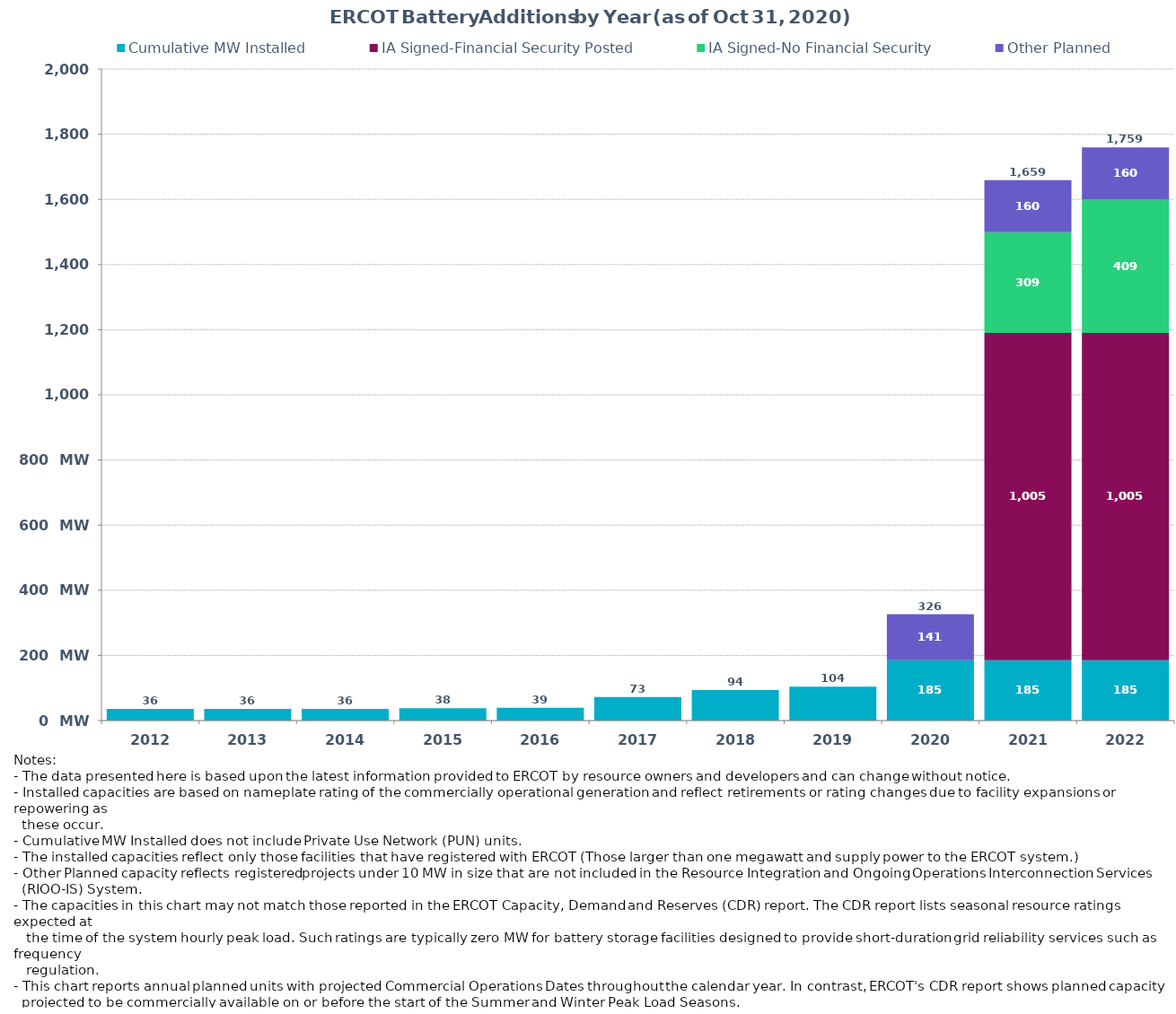
| Category | Cumulative MW Installed | Cumulative MW Synchronized | IA Signed-Financial Security Posted  | IA Signed-No Financial Security  | Other Planned | Cumulative Installed and Planned |
|---|---|---|---|---|---|---|
| 2012.0 | 36 | 0 | 0 | 0 | 0 | 36 |
| 2013.0 | 36 | 0 | 0 | 0 | 0 | 36 |
| 2014.0 | 36 | 0 | 0 | 0 | 0 | 36 |
| 2015.0 | 38 | 0 | 0 | 0 | 0 | 38 |
| 2016.0 | 39 | 0 | 0 | 0 | 0 | 39 |
| 2017.0 | 72.5 | 0 | 0 | 0 | 0 | 72.5 |
| 2018.0 | 93.8 | 0 | 0 | 0 | 0 | 93.8 |
| 2019.0 | 103.7 | 0 | 0 | 0 | 0 | 103.7 |
| 2020.0 | 185.4 | 0 | 0 | 0 | 141 | 326.4 |
| 2021.0 | 185.4 | 0 | 1005.02 | 308.61 | 160.38 | 1659.41 |
| 2022.0 | 185.4 | 0 | 1005.02 | 408.61 | 160.38 | 1759.41 |